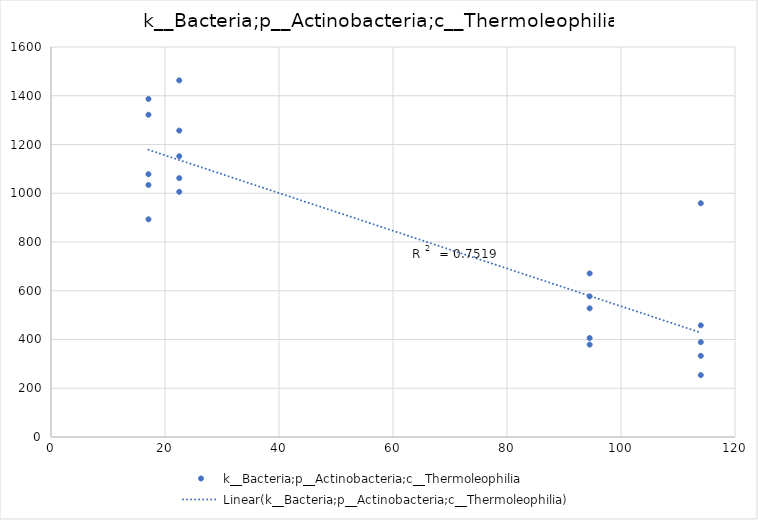
| Category | k__Bacteria;p__Actinobacteria;c__Thermoleophilia |
|---|---|
| 114.0 | 458 |
| 114.0 | 333 |
| 114.0 | 254 |
| 114.0 | 389 |
| 114.0 | 959 |
| 94.5 | 577 |
| 94.5 | 406 |
| 94.5 | 379 |
| 94.5 | 528 |
| 94.5 | 671 |
| 17.1 | 1034 |
| 17.1 | 893 |
| 17.1 | 1387 |
| 17.1 | 1078 |
| 17.1 | 1322 |
| 22.5 | 1257 |
| 22.5 | 1152 |
| 22.5 | 1463 |
| 22.5 | 1006 |
| 22.5 | 1062 |